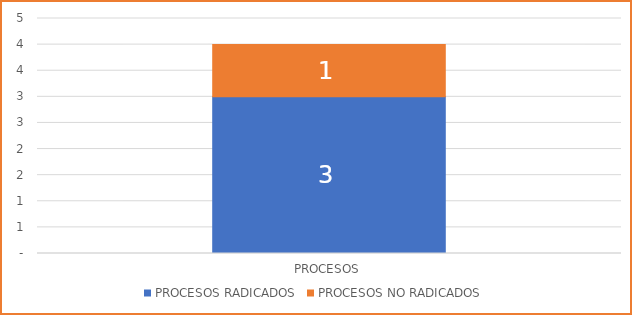
| Category |  PROCESOS RADICADOS  |  PROCESOS NO RADICADOS  |
|---|---|---|
|  PROCESOS  | 3 | 1 |